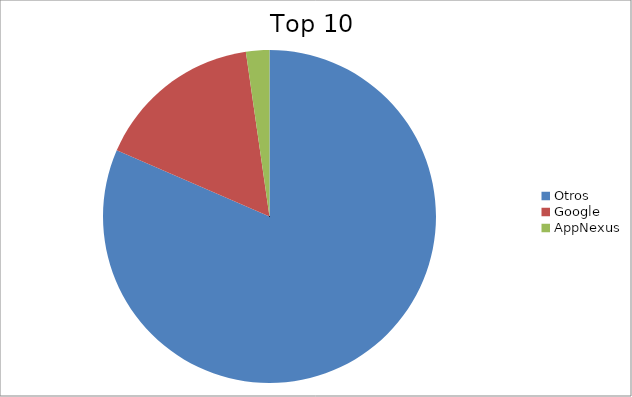
| Category | Series 0 |
|---|---|
| Otros | 81.51 |
| Google | 16.22 |
| AppNexus | 2.27 |